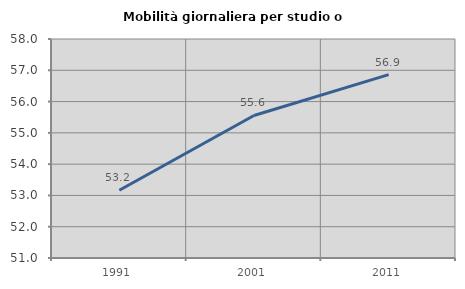
| Category | Mobilità giornaliera per studio o lavoro |
|---|---|
| 1991.0 | 53.165 |
| 2001.0 | 55.556 |
| 2011.0 | 56.863 |